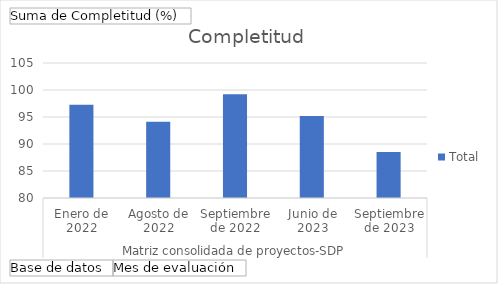
| Category | Total |
|---|---|
| 0 | 97.26 |
| 1 | 94.11 |
| 2 | 99.22 |
| 3 | 95.17 |
| 4 | 88.5 |